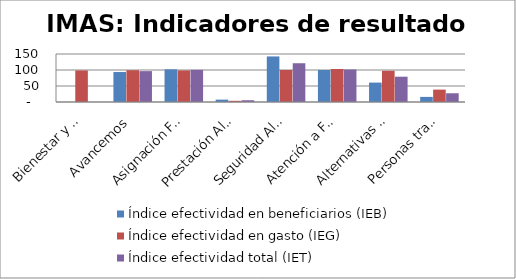
| Category | Índice efectividad en beneficiarios (IEB) | Índice efectividad en gasto (IEG)  | Índice efectividad total (IET) |
|---|---|---|---|
| Bienestar y Promocion Familiar | 0 | 98.592 | 0 |
| Avancemos | 93.65 | 99.335 | 96.493 |
| Asignación Familiar | 102.013 | 98.74 | 100.376 |
| Prestación Alimentaria | 7.389 | 3.745 | 5.567 |
| Seguridad Alimentaria | 142.383 | 99.932 | 121.157 |
| Atención a Familias | 100.004 | 103.204 | 101.604 |
| Alternativas de Cuido | 60.652 | 97.502 | 79.077 |
| Personas trabajadores menores de edad | 15.909 | 38.68 | 27.295 |